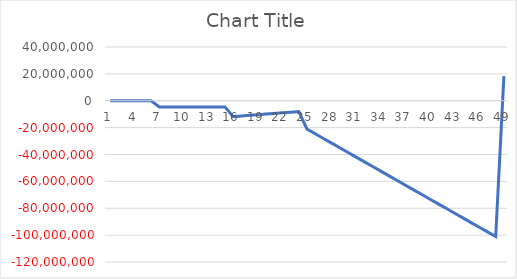
| Category | Series 0 |
|---|---|
| 0 | 0 |
| 1 | 0 |
| 2 | 0 |
| 3 | 0 |
| 4 | 0 |
| 5 | 0 |
| 6 | -4576299.776 |
| 7 | -4576299.776 |
| 8 | -4576299.776 |
| 9 | -4576299.776 |
| 10 | -4576299.776 |
| 11 | -4576299.776 |
| 12 | -4576299.776 |
| 13 | -4576299.776 |
| 14 | -4576299.776 |
| 15 | -11802740.6 |
| 16 | -11328442.172 |
| 17 | -10854143.743 |
| 18 | -10379845.315 |
| 19 | -9905546.887 |
| 20 | -9431248.459 |
| 21 | -8956950.031 |
| 22 | -8482651.603 |
| 23 | -8008353.174 |
| 24 | -21111757.321 |
| 25 | -24589237.403 |
| 26 | -28066717.485 |
| 27 | -31544197.566 |
| 28 | -35021677.648 |
| 29 | -38499157.73 |
| 30 | -41976637.811 |
| 31 | -45454117.893 |
| 32 | -48931597.975 |
| 33 | -52409078.057 |
| 34 | -55886558.138 |
| 35 | -59364038.22 |
| 36 | -62841518.302 |
| 37 | -66318998.383 |
| 38 | -69796478.465 |
| 39 | -73273958.547 |
| 40 | -76751438.628 |
| 41 | -80228918.71 |
| 42 | -83706398.792 |
| 43 | -87183878.874 |
| 44 | -90661358.955 |
| 45 | -94138839.037 |
| 46 | -97616319.119 |
| 47 | -101093799.2 |
| 48 | 18282838.994 |